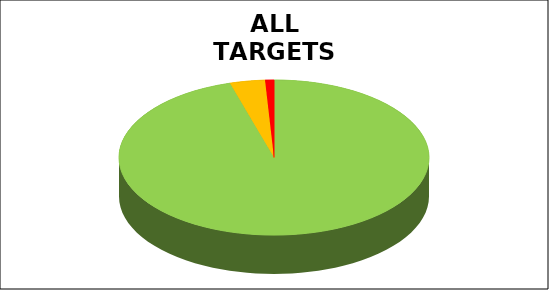
| Category | Series 0 |
|---|---|
| Green | 0.954 |
| Amber | 0.037 |
| Red | 0.009 |